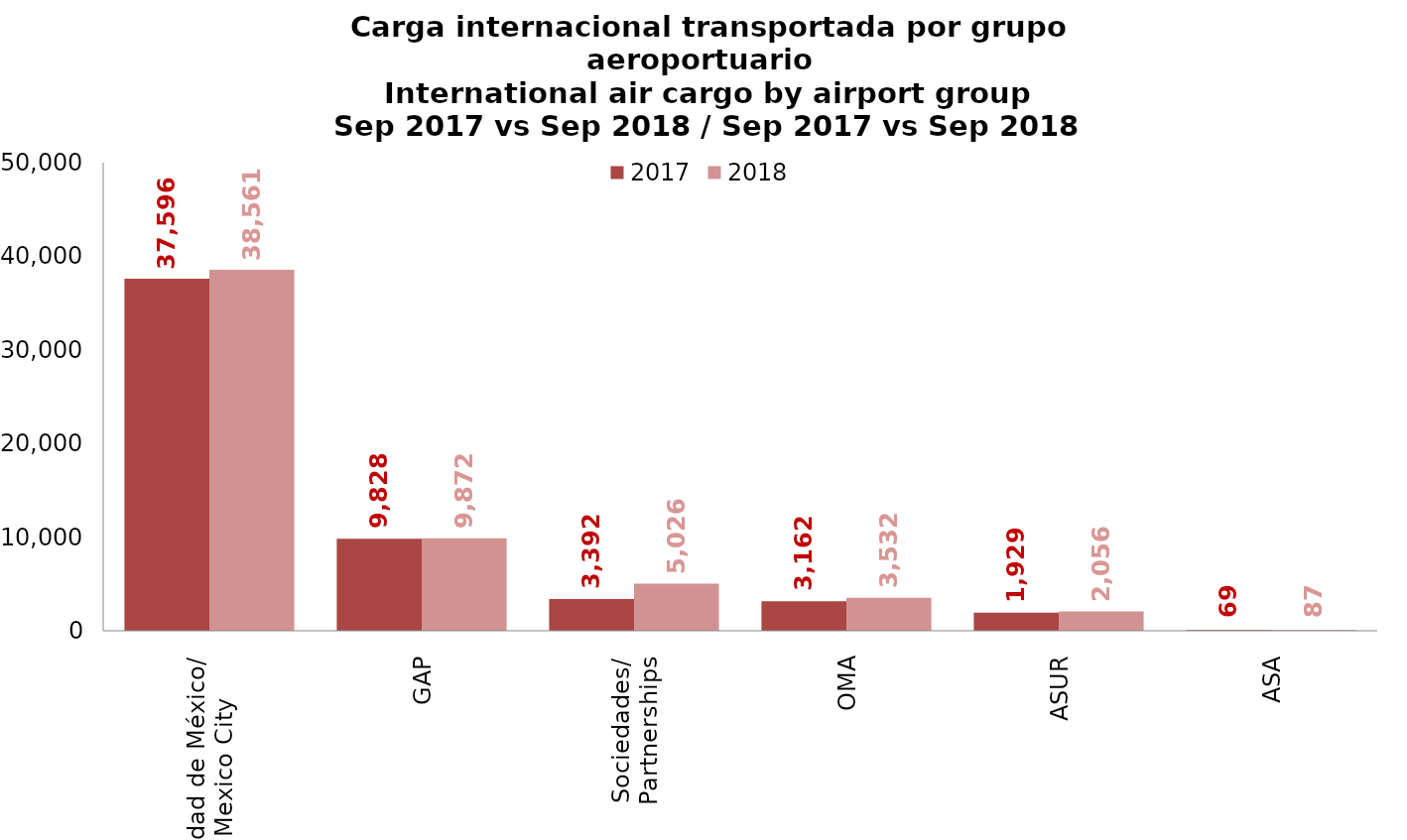
| Category | 2017 | 2018 |
|---|---|---|
| Ciudad de México/
Mexico City | 37596.01 | 38560.64 |
| GAP | 9827.682 | 9871.97 |
| Sociedades/
Partnerships | 3391.94 | 5026.389 |
| OMA | 3161.712 | 3532.359 |
| ASUR | 1929.099 | 2056.201 |
| ASA | 68.574 | 87.064 |